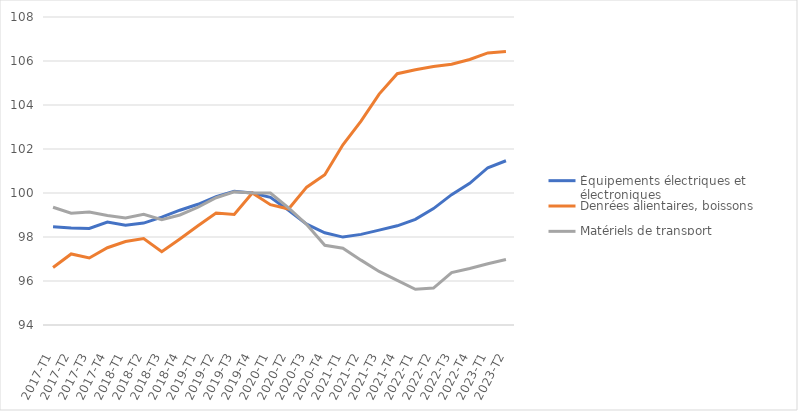
| Category | Équipements électriques et électroniques | Denrées alientaires, boissons | Matériels de transport |
|---|---|---|---|
| 2017-T1 | 98.46 | 96.617 | 99.352 |
| 2017-T2 | 98.412 | 97.231 | 99.082 |
| 2017-T3 | 98.387 | 97.048 | 99.136 |
| 2017-T4 | 98.68 | 97.512 | 98.974 |
| 2018-T1 | 98.534 | 97.794 | 98.866 |
| 2018-T2 | 98.631 | 97.927 | 99.028 |
| 2018-T3 | 98.9 | 97.33 | 98.785 |
| 2018-T4 | 99.218 | 97.91 | 99.001 |
| 2019-T1 | 99.487 | 98.507 | 99.352 |
| 2019-T2 | 99.829 | 99.088 | 99.784 |
| 2019-T3 | 100.073 | 99.022 | 100.054 |
| 2019-T4 | 100 | 100 | 100 |
| 2020-T1 | 99.804 | 99.469 | 100 |
| 2020-T2 | 99.218 | 99.27 | 99.325 |
| 2020-T3 | 98.583 | 100.265 | 98.569 |
| 2020-T4 | 98.192 | 100.829 | 97.624 |
| 2021-T1 | 97.996 | 102.189 | 97.489 |
| 2021-T2 | 98.118 | 103.267 | 96.948 |
| 2021-T3 | 98.314 | 104.494 | 96.435 |
| 2021-T4 | 98.509 | 105.423 | 96.03 |
| 2022-T1 | 98.803 | 105.605 | 95.625 |
| 2022-T2 | 99.291 | 105.755 | 95.679 |
| 2022-T3 | 99.927 | 105.854 | 96.381 |
| 2022-T4 | 100.44 | 106.07 | 96.57 |
| 2023-T1 | 101.149 | 106.368 | 96.786 |
| 2023-T2 | 101.466 | 106.434 | 96.975 |